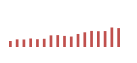
| Category | Importações (2) |
|---|---|
| 0 | 63256.661 |
| 1 | 80362.628 |
| 2 | 79098.748 |
| 3 | 89493.365 |
| 4 | 81914.569 |
| 5 | 86371.3 |
| 6 | 122399.001 |
| 7 | 125153.991 |
| 8 | 116754.909 |
| 9 | 110190.536 |
| 10 | 137205.926 |
| 11 | 154727.051 |
| 12 | 169208.338 |
| 13 | 166254.713 |
| 14 | 167736.792 |
| 15 | 205343.675 |
| 16 | 199089.788 |